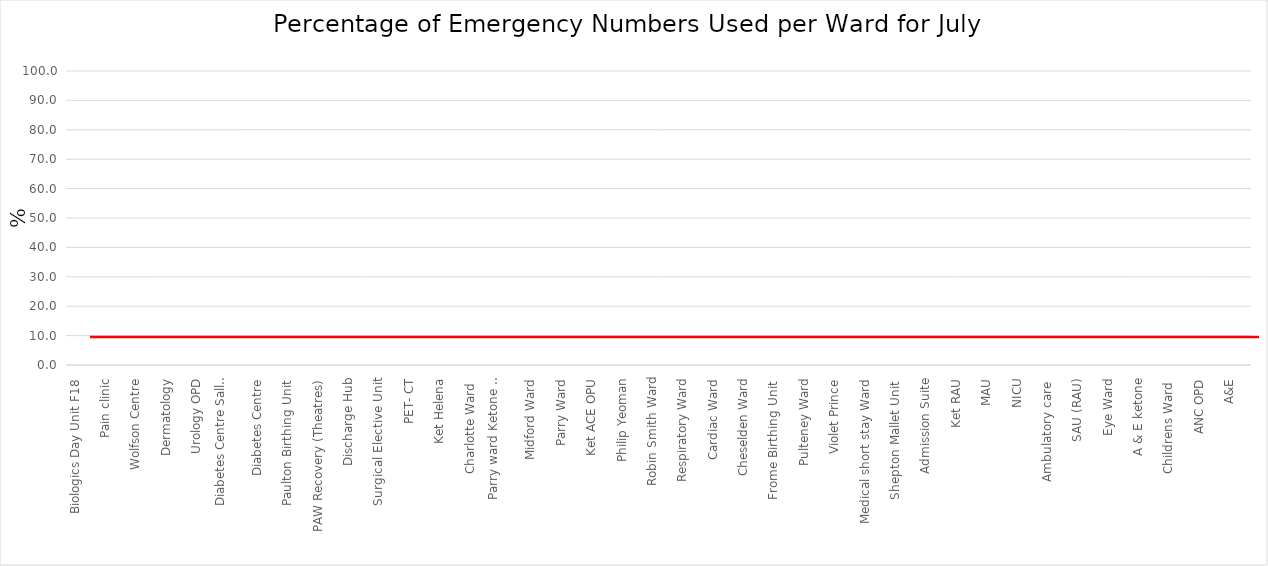
| Category | Series 0 |
|---|---|
| Biologics Day Unit F18 | 0 |
| Biologics OP F8 | 0 |
| Pain clinic | 0 |
| Trauma Assessment Unit | 0 |
| Wolfson Centre | 0 |
| Cardiac OP | 0 |
| Dermatology | 0 |
| Nuclear Medicine | 0 |
| Urology OPD | 0 |
| Vascular Studies | 0 |
| Diabetes Centre Sally Wylie | 0 |
| X-Ray | 0 |
| Diabetes Centre | 0 |
| Frailty Assessment Unit | 0 |
| Paulton Birthing Unit  | 0 |
| DAU C'ham clinic | 0 |
| PAW Recovery (Theatres) | 0 |
| SSSU ( day surgery recovery) | 0 |
| Discharge Hub | 0 |
| Gastro Unit | 0 |
| Surgical Elective Unit | 0 |
| Chippenham Birthing Unit  | 0 |
| PET- CT | 0 |
| William Budd Ward | 0 |
| Ket Helena | 0 |
| CCU | 0 |
| Charlotte Ward  | 0 |
| Combe Ward | 0 |
| Parry ward Ketone + Glucose | 0 |
| Day Surgery Ward | 0 |
| Midford Ward | 0 |
| ACE OPU | 0 |
| Parry Ward | 0 |
| Ket Haygarth | 0 |
| Ket ACE OPU | 0 |
| Acute Stroke Unit | 0 |
| Philip Yeoman | 0 |
| Forrester Brown | 0 |
| Robin Smith Ward | 0 |
| Ket pulteny ward | 0 |
| Respiratory Ward | 0 |
| Ket Medical short stay | 0 |
| Cardiac Ward | 0 |
| Helena Ward | 0 |
| Cheselden Ward | 0 |
| Haygarth | 0 |
| Frome Birthing Unit  | 0 |
| Theatres Recovery | 0 |
| Pulteney Ward | 0 |
| Eye OPD  | 0 |
| Violet Prince | 0 |
| Philip Yeoman Ortho Recovery | 0 |
| Medical short stay Ward | 0 |
| Waterhouse Ward | 0 |
| Shepton Mallet Unit  | 0 |
| Pierce ward | 0 |
| Admission Suite | 0 |
| Trowbridge Birthing Unit  | 0 |
| Ket RAU | 0 |
| Pre assessment | 0 |
| MAU | 0 |
| Will Budd Day Case & ONC OPD | 0 |
| NICU | 0 |
| MAU Ketone Only | 0 |
| Ambulatory care  | 0 |
| Diabetes link nurse | 0 |
| SAU (RAU) | 0 |
| ITU Ketone + Glucose | 0 |
| Eye Ward | 0 |
| UTC | 0 |
| A & E ketone | 0 |
| BBC | 0 |
| Childrens Ward  | 0 |
| Childrens OPD  | 0 |
| ANC OPD | 0 |
| Mary Ward  | 0 |
| A&E | 0 |
| Cardiac Cath Lab | 0 |